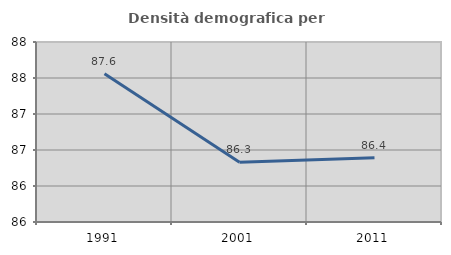
| Category | Densità demografica |
|---|---|
| 1991.0 | 87.561 |
| 2001.0 | 86.329 |
| 2011.0 | 86.394 |